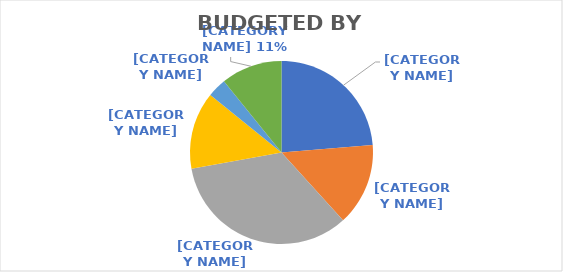
| Category | Series 0 | Series 1 |
|---|---|---|
| Behavioral Health (Adult/Children) | 130285087.49 | 0.237 |
| Child Care | 80044280 | 0.146 |
| Infrastructure | 186241068.68 | 0.339 |
| Public Health | 75142298.98 | 0.137 |
| Social Services | 18433823.44 | 0.034 |
| Workforce | 59506325.28 | 0.108 |